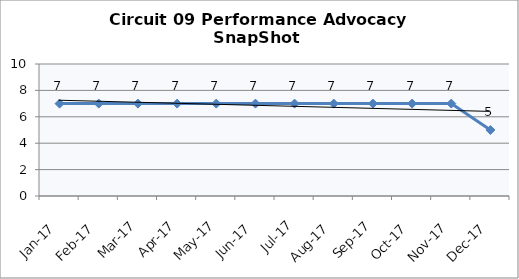
| Category | Circuit 09 |
|---|---|
| Jan-17 | 7 |
| Feb-17 | 7 |
| Mar-17 | 7 |
| Apr-17 | 7 |
| May-17 | 7 |
| Jun-17 | 7 |
| Jul-17 | 7 |
| Aug-17 | 7 |
| Sep-17 | 7 |
| Oct-17 | 7 |
| Nov-17 | 7 |
| Dec-17 | 5 |